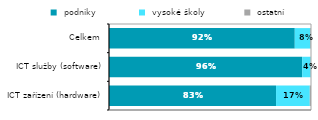
| Category |  podniky  |  vysoké školy |  ostatní  |
|---|---|---|---|
|   ICT zařízení (hardware) | 0.827 | 0.167 | 0.006 |
|   ICT služby (software) | 0.956 | 0.041 | 0.002 |
| Celkem | 0.92 | 0.077 | 0.003 |